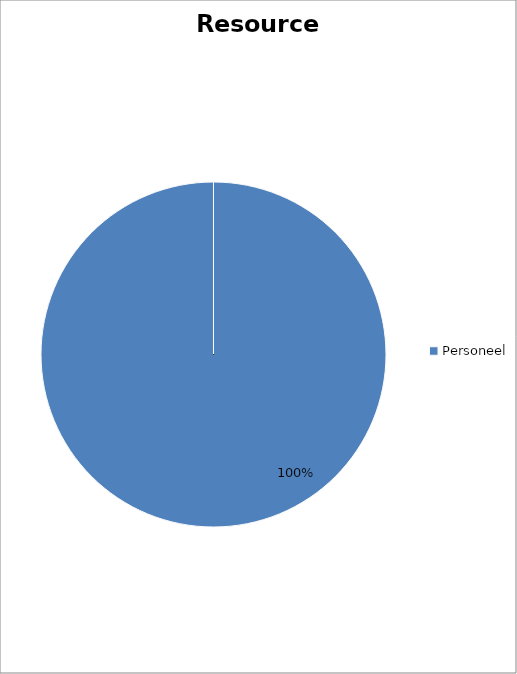
| Category | data |
|---|---|
| Personeel | 43059.148 |